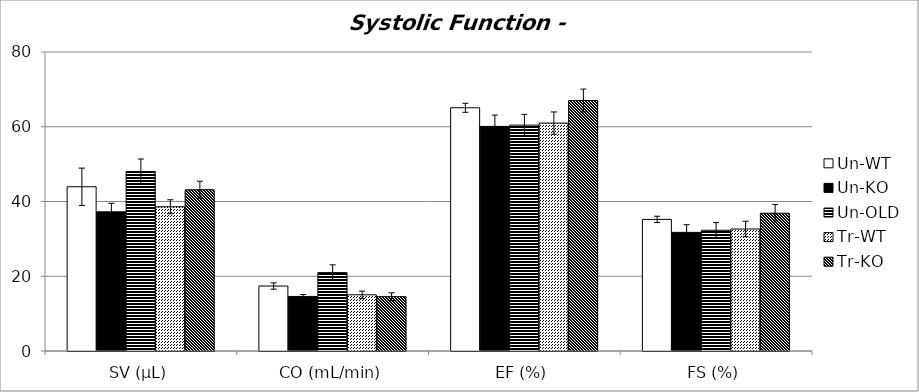
| Category | Un-WT | Un-KO | Un-OLD | Tr-WT | Tr-KO |
|---|---|---|---|---|---|
| SV (μL) | 43.943 | 37.229 | 48.026 | 38.591 | 43.148 |
| CO (mL/min) | 17.385 | 14.596 | 20.977 | 15.036 | 14.545 |
| EF (%) | 65.078 | 60.09 | 60.432 | 60.977 | 67.022 |
| FS (%) | 35.214 | 31.741 | 32.306 | 32.641 | 36.868 |